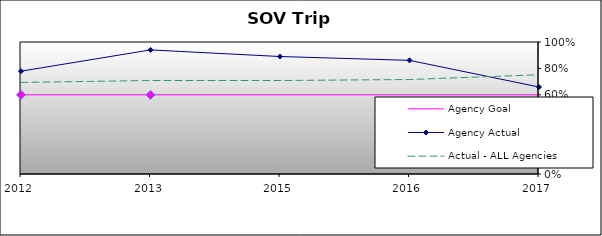
| Category | Agency Goal | Agency Actual | Actual - ALL Agencies |
|---|---|---|---|
| 2012.0 | 0.6 | 0.779 | 0.694 |
| 2013.0 | 0.6 | 0.94 | 0.708 |
| 2015.0 | 0.6 | 0.89 | 0.708 |
| 2016.0 | 0.6 | 0.861 | 0.716 |
| 2017.0 | 0.6 | 0.659 | 0.752 |